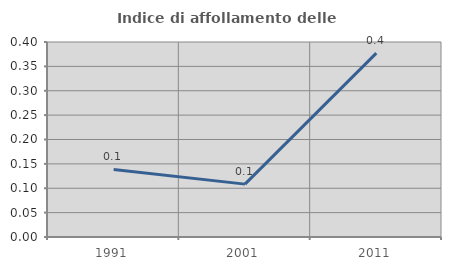
| Category | Indice di affollamento delle abitazioni  |
|---|---|
| 1991.0 | 0.139 |
| 2001.0 | 0.108 |
| 2011.0 | 0.377 |